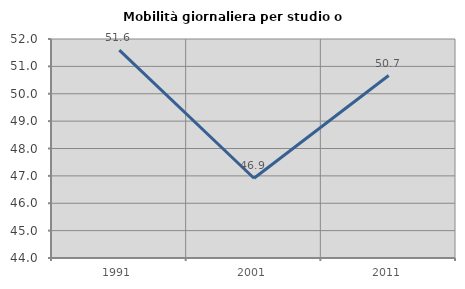
| Category | Mobilità giornaliera per studio o lavoro |
|---|---|
| 1991.0 | 51.591 |
| 2001.0 | 46.914 |
| 2011.0 | 50.666 |